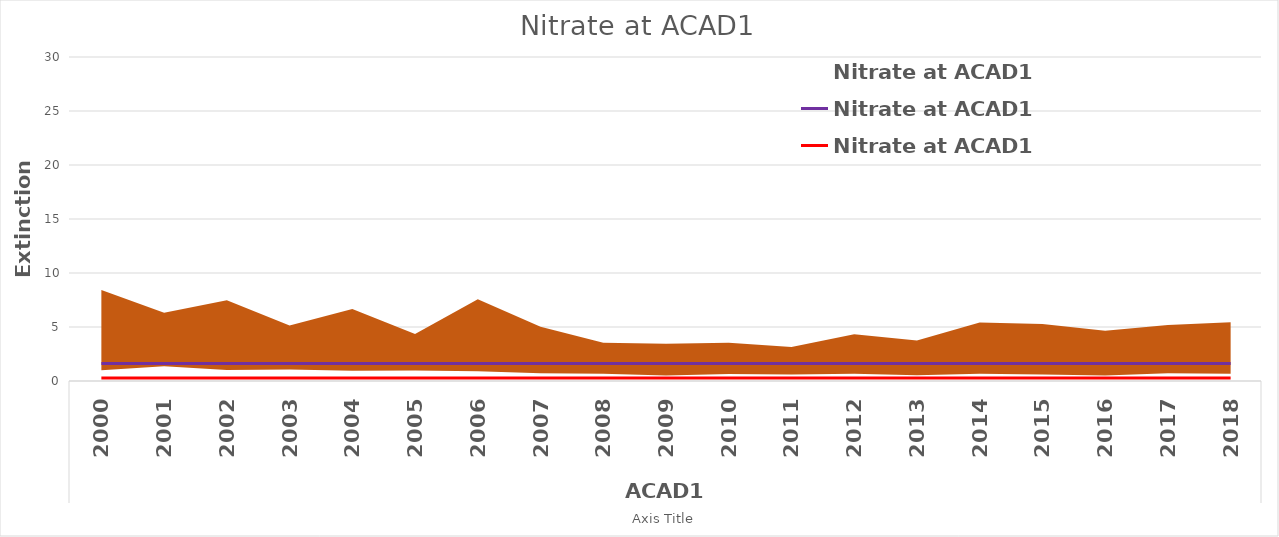
| Category | Natural - Best |  Natural Routine - Most Impaired |
|---|---|---|
| 0 | 0.273 | 1.628 |
| 1 | 0.273 | 1.628 |
| 2 | 0.273 | 1.628 |
| 3 | 0.273 | 1.628 |
| 4 | 0.273 | 1.628 |
| 5 | 0.273 | 1.628 |
| 6 | 0.273 | 1.628 |
| 7 | 0.273 | 1.628 |
| 8 | 0.273 | 1.628 |
| 9 | 0.273 | 1.628 |
| 10 | 0.273 | 1.628 |
| 11 | 0.273 | 1.628 |
| 12 | 0.273 | 1.628 |
| 13 | 0.273 | 1.628 |
| 14 | 0.273 | 1.628 |
| 15 | 0.273 | 1.628 |
| 16 | 0.273 | 1.628 |
| 17 | 0.273 | 1.628 |
| 18 | 0.273 | 1.628 |